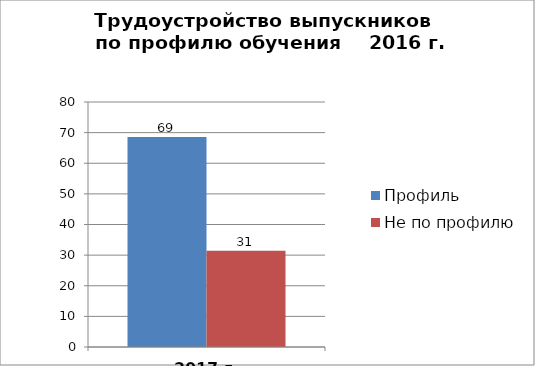
| Category | Профиль | Не по профилю |
|---|---|---|
| 2017 г. (%) | 68.539 | 31.461 |